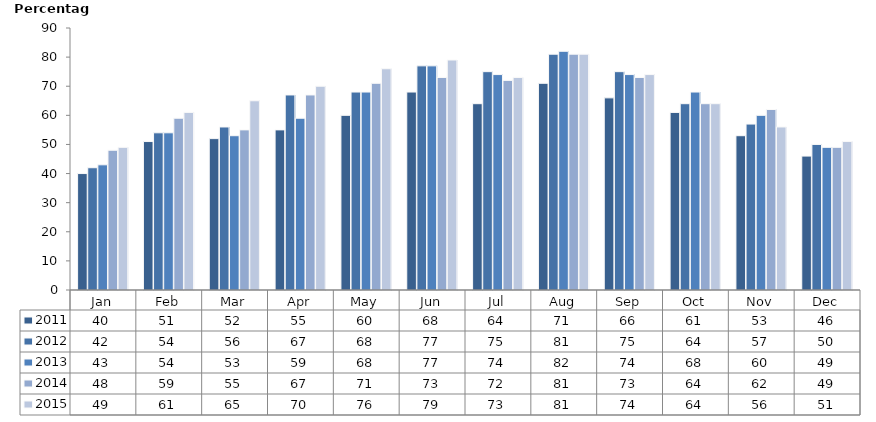
| Category | 2011 | 2012 | 2013 | 2014 | 2015 |
|---|---|---|---|---|---|
| Jan | 40 | 42 | 43 | 48 | 49 |
| Feb | 51 | 54 | 54 | 59 | 61 |
| Mar | 52 | 56 | 53 | 55 | 65 |
| Apr | 55 | 67 | 59 | 67 | 70 |
| May | 60 | 68 | 68 | 71 | 76 |
| Jun | 68 | 77 | 77 | 73 | 79 |
| Jul | 64 | 75 | 74 | 72 | 73 |
| Aug | 71 | 81 | 82 | 81 | 81 |
| Sep | 66 | 75 | 74 | 73 | 74 |
| Oct | 61 | 64 | 68 | 64 | 64 |
| Nov | 53 | 57 | 60 | 62 | 56 |
| Dec | 46 | 50 | 49 | 49 | 51 |